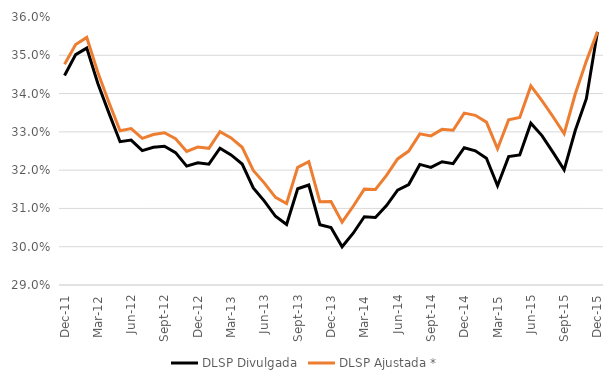
| Category | DLSP Divulgada | DLSP Ajustada * |
|---|---|---|
| 2011-12-01 | 0.345 | 0.348 |
| 2012-01-01 | 0.35 | 0.353 |
| 2012-02-01 | 0.352 | 0.355 |
| 2012-03-01 | 0.343 | 0.345 |
| 2012-04-01 | 0.335 | 0.338 |
| 2012-05-01 | 0.327 | 0.33 |
| 2012-06-01 | 0.328 | 0.331 |
| 2012-07-01 | 0.325 | 0.328 |
| 2012-08-01 | 0.326 | 0.329 |
| 2012-09-01 | 0.326 | 0.33 |
| 2012-10-01 | 0.325 | 0.328 |
| 2012-11-01 | 0.321 | 0.325 |
| 2012-12-01 | 0.322 | 0.326 |
| 2013-01-01 | 0.322 | 0.326 |
| 2013-02-01 | 0.326 | 0.33 |
| 2013-03-01 | 0.324 | 0.328 |
| 2013-04-01 | 0.322 | 0.326 |
| 2013-05-01 | 0.315 | 0.32 |
| 2013-06-01 | 0.312 | 0.317 |
| 2013-07-01 | 0.308 | 0.313 |
| 2013-08-01 | 0.306 | 0.311 |
| 2013-09-01 | 0.315 | 0.321 |
| 2013-10-01 | 0.316 | 0.322 |
| 2013-11-01 | 0.306 | 0.312 |
| 2013-12-01 | 0.305 | 0.312 |
| 2014-01-01 | 0.3 | 0.306 |
| 2014-02-01 | 0.304 | 0.311 |
| 2014-03-01 | 0.308 | 0.315 |
| 2014-04-01 | 0.308 | 0.315 |
| 2014-05-01 | 0.311 | 0.319 |
| 2014-06-01 | 0.315 | 0.323 |
| 2014-07-01 | 0.316 | 0.325 |
| 2014-08-01 | 0.321 | 0.329 |
| 2014-09-01 | 0.321 | 0.329 |
| 2014-10-01 | 0.322 | 0.331 |
| 2014-11-01 | 0.322 | 0.33 |
| 2014-12-01 | 0.326 | 0.335 |
| 2015-01-01 | 0.325 | 0.334 |
| 2015-02-01 | 0.323 | 0.333 |
| 2015-03-01 | 0.316 | 0.326 |
| 2015-04-01 | 0.324 | 0.333 |
| 2015-05-01 | 0.324 | 0.334 |
| 2015-06-01 | 0.332 | 0.342 |
| 2015-07-01 | 0.329 | 0.338 |
| 2015-08-01 | 0.325 | 0.334 |
| 2015-09-01 | 0.32 | 0.33 |
| 2015-10-01 | 0.33 | 0.34 |
| 2015-11-01 | 0.339 | 0.348 |
| 2015-12-01 | 0.356 | 0.356 |